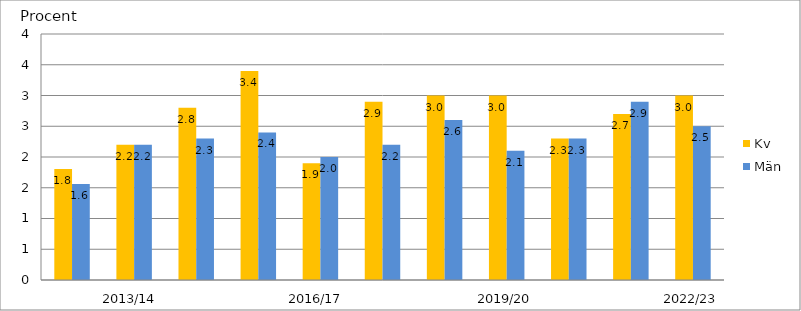
| Category | Kv | Män |
|---|---|---|
|  | 1.807 | 1.563 |
| 2013/14  | 2.2 | 2.2 |
|  | 2.8 | 2.3 |
|  | 3.4 | 2.4 |
| 2016/17  | 1.9 | 2 |
|  | 2.9 | 2.2 |
|  | 3 | 2.6 |
| 2019/20 | 3 | 2.1 |
|  | 2.3 | 2.3 |
|  | 2.7 | 2.9 |
| 2022/23 | 3 | 2.5 |